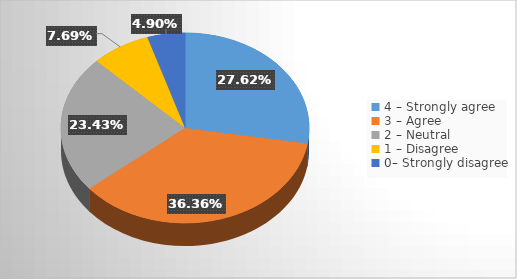
| Category | Series 0 |
|---|---|
| 4 – Strongly agree  | 0.276 |
| 3 – Agree  | 0.364 |
| 2 – Neutral   | 0.234 |
| 1 – Disagree   | 0.077 |
| 0– Strongly disagree | 0.049 |